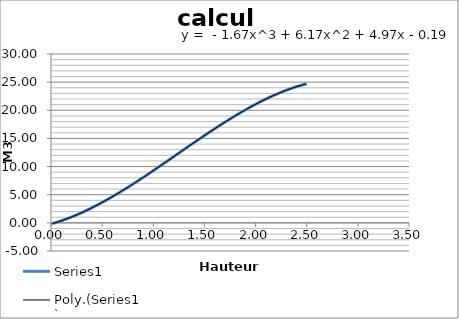
| Category | Series 0 |
|---|---|
| 0.01 | -0.14 |
| 0.02 | -0.088 |
| 0.03 | -0.035 |
| 0.04 | 0.019 |
| 0.05 | 0.074 |
| 0.06 | 0.13 |
| 0.07 | 0.188 |
| 0.08 | 0.246 |
| 0.09 | 0.306 |
| 0.1 | 0.367 |
| 0.11 | 0.429 |
| 0.12 | 0.492 |
| 0.13 | 0.557 |
| 0.14 | 0.622 |
| 0.15 | 0.689 |
| 0.16 | 0.756 |
| 0.17 | 0.825 |
| 0.18 | 0.895 |
| 0.19 | 0.966 |
| 0.2 | 1.037 |
| 0.21 | 1.11 |
| 0.22 | 1.184 |
| 0.23 | 1.259 |
| 0.24 | 1.335 |
| 0.25 | 1.412 |
| 0.26 | 1.49 |
| 0.27 | 1.569 |
| 0.28 | 1.649 |
| 0.29 | 1.729 |
| 0.3 | 1.811 |
| 0.31 | 1.894 |
| 0.32 | 1.977 |
| 0.33 | 2.062 |
| 0.34 | 2.147 |
| 0.35 | 2.234 |
| 0.36 | 2.321 |
| 0.37 | 2.409 |
| 0.38 | 2.498 |
| 0.39 | 2.588 |
| 0.4 | 2.678 |
| 0.41 | 2.77 |
| 0.42 | 2.862 |
| 0.43 | 2.955 |
| 0.44 | 3.049 |
| 0.45 | 3.144 |
| 0.46 | 3.239 |
| 0.47 | 3.335 |
| 0.48 | 3.432 |
| 0.49 | 3.53 |
| 0.5 | 3.629 |
| 0.51 | 3.728 |
| 0.52 | 3.828 |
| 0.53 | 3.929 |
| 0.54 | 4.03 |
| 0.55 | 4.132 |
| 0.56 | 4.235 |
| 0.57 | 4.338 |
| 0.58 | 4.442 |
| 0.59 | 4.547 |
| 0.6 | 4.652 |
| 0.61 | 4.758 |
| 0.62 | 4.865 |
| 0.63 | 4.972 |
| 0.64 | 5.08 |
| 0.65 | 5.189 |
| 0.66 | 5.298 |
| 0.67 | 5.407 |
| 0.68 | 5.518 |
| 0.69 | 5.628 |
| 0.7 | 5.739 |
| 0.71 | 5.851 |
| 0.72 | 5.964 |
| 0.73 | 6.076 |
| 0.74 | 6.19 |
| 0.75 | 6.304 |
| 0.76 | 6.418 |
| 0.77 | 6.533 |
| 0.78 | 6.648 |
| 0.79 | 6.764 |
| 0.8 | 6.88 |
| 0.81 | 6.996 |
| 0.82 | 7.113 |
| 0.83 | 7.231 |
| 0.84 | 7.349 |
| 0.85 | 7.467 |
| 0.86 | 7.585 |
| 0.87 | 7.704 |
| 0.88 | 7.824 |
| 0.89 | 7.943 |
| 0.9 | 8.063 |
| 0.91 | 8.184 |
| 0.92 | 8.304 |
| 0.93 | 8.425 |
| 0.94 | 8.547 |
| 0.95 | 8.668 |
| 0.96 | 8.79 |
| 0.97 | 8.912 |
| 0.98 | 9.034 |
| 0.99 | 9.157 |
| 1.0 | 9.28 |
| 1.01 | 9.403 |
| 1.02 | 9.526 |
| 1.03 | 9.65 |
| 1.04 | 9.774 |
| 1.05 | 9.898 |
| 1.06 | 10.022 |
| 1.07 | 10.146 |
| 1.08 | 10.271 |
| 1.09 | 10.395 |
| 1.1 | 10.52 |
| 1.11 | 10.645 |
| 1.12 | 10.77 |
| 1.13 | 10.895 |
| 1.14 | 11.02 |
| 1.15 | 11.145 |
| 1.16 | 11.271 |
| 1.17 | 11.396 |
| 1.18 | 11.522 |
| 1.19 | 11.647 |
| 1.2 | 11.773 |
| 1.21 | 11.899 |
| 1.22 | 12.024 |
| 1.23 | 12.15 |
| 1.24 | 12.276 |
| 1.25 | 12.401 |
| 1.26 | 12.527 |
| 1.27 | 12.653 |
| 1.28 | 12.778 |
| 1.29 | 12.904 |
| 1.3 | 13.029 |
| 1.31 | 13.155 |
| 1.32 | 13.28 |
| 1.33 | 13.405 |
| 1.34 | 13.53 |
| 1.35 | 13.655 |
| 1.36 | 13.78 |
| 1.37 | 13.905 |
| 1.38 | 14.03 |
| 1.39 | 14.154 |
| 1.4 | 14.279 |
| 1.41 | 14.403 |
| 1.42 | 14.527 |
| 1.43 | 14.651 |
| 1.44 | 14.774 |
| 1.45 | 14.898 |
| 1.46 | 15.021 |
| 1.47 | 15.144 |
| 1.48 | 15.267 |
| 1.49 | 15.389 |
| 1.5 | 15.511 |
| 1.51 | 15.633 |
| 1.52 | 15.755 |
| 1.53 | 15.876 |
| 1.54 | 15.997 |
| 1.55 | 16.118 |
| 1.56 | 16.238 |
| 1.57 | 16.359 |
| 1.58 | 16.478 |
| 1.59 | 16.598 |
| 1.6 | 16.717 |
| 1.61 | 16.836 |
| 1.62 | 16.954 |
| 1.63 | 17.072 |
| 1.64 | 17.189 |
| 1.65 | 17.306 |
| 1.66 | 17.423 |
| 1.67 | 17.539 |
| 1.68 | 17.655 |
| 1.69 | 17.771 |
| 1.7 | 17.886 |
| 1.71 | 18 |
| 1.72 | 18.114 |
| 1.73 | 18.228 |
| 1.74 | 18.34 |
| 1.75 | 18.453 |
| 1.76 | 18.565 |
| 1.77 | 18.676 |
| 1.78 | 18.787 |
| 1.79 | 18.898 |
| 1.8 | 19.007 |
| 1.81 | 19.117 |
| 1.82 | 19.225 |
| 1.83 | 19.333 |
| 1.84 | 19.441 |
| 1.85 | 19.548 |
| 1.86 | 19.654 |
| 1.87 | 19.759 |
| 1.88 | 19.864 |
| 1.89 | 19.969 |
| 1.9 | 20.072 |
| 1.91 | 20.175 |
| 1.92 | 20.277 |
| 1.93 | 20.379 |
| 1.94 | 20.48 |
| 1.95 | 20.58 |
| 1.96 | 20.68 |
| 1.97 | 20.778 |
| 1.98 | 20.876 |
| 1.99 | 20.974 |
| 2.0 | 21.07 |
| 2.01 | 21.166 |
| 2.02 | 21.261 |
| 2.03 | 21.355 |
| 2.04 | 21.448 |
| 2.05 | 21.541 |
| 2.06 | 21.632 |
| 2.07 | 21.723 |
| 2.08 | 21.813 |
| 2.09 | 21.902 |
| 2.1 | 21.991 |
| 2.11 | 22.078 |
| 2.12 | 22.165 |
| 2.13 | 22.251 |
| 2.14 | 22.335 |
| 2.15 | 22.419 |
| 2.16 | 22.502 |
| 2.17 | 22.584 |
| 2.18 | 22.665 |
| 2.19 | 22.745 |
| 2.2 | 22.825 |
| 2.21 | 22.903 |
| 2.22 | 22.98 |
| 2.23 | 23.056 |
| 2.24 | 23.132 |
| 2.25 | 23.206 |
| 2.26 | 23.279 |
| 2.27 | 23.351 |
| 2.28 | 23.422 |
| 2.29 | 23.492 |
| 2.3 | 23.561 |
| 2.31 | 23.629 |
| 2.32 | 23.696 |
| 2.33 | 23.762 |
| 2.34 | 23.827 |
| 2.35 | 23.89 |
| 2.36 | 23.953 |
| 2.37 | 24.014 |
| 2.38 | 24.074 |
| 2.39 | 24.133 |
| 2.4 | 24.191 |
| 2.41 | 24.248 |
| 2.42 | 24.303 |
| 2.43 | 24.358 |
| 2.44 | 24.411 |
| 2.45 | 24.463 |
| 2.46 | 24.513 |
| 2.47 | 24.563 |
| 2.48 | 24.611 |
| 2.49 | 24.658 |
| 2.5 | 24.704 |